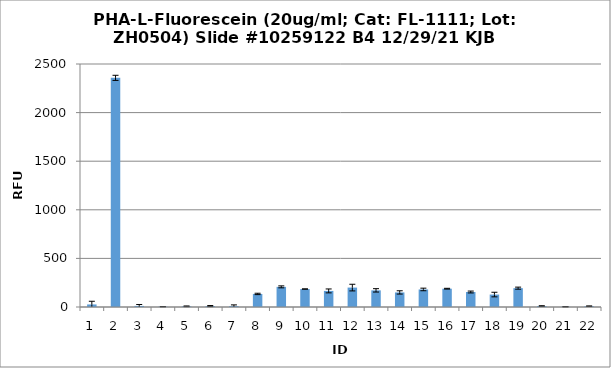
| Category | Series 0 |
|---|---|
| 0 | 26.25 |
| 1 | 2357.5 |
| 2 | 11.25 |
| 3 | 3 |
| 4 | 7 |
| 5 | 9.5 |
| 6 | 9.75 |
| 7 | 134.5 |
| 8 | 207.25 |
| 9 | 184.75 |
| 10 | 165.5 |
| 11 | 199.75 |
| 12 | 171.25 |
| 13 | 150 |
| 14 | 180.5 |
| 15 | 188.25 |
| 16 | 154.25 |
| 17 | 128 |
| 18 | 193.75 |
| 19 | 9.75 |
| 20 | 2.5 |
| 21 | 8.25 |